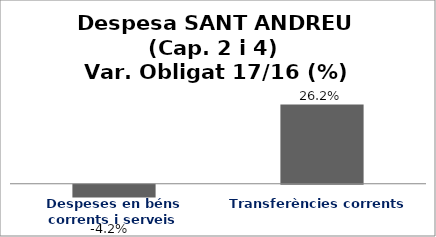
| Category | Series 0 |
|---|---|
| Despeses en béns corrents i serveis | -0.042 |
| Transferències corrents | 0.262 |